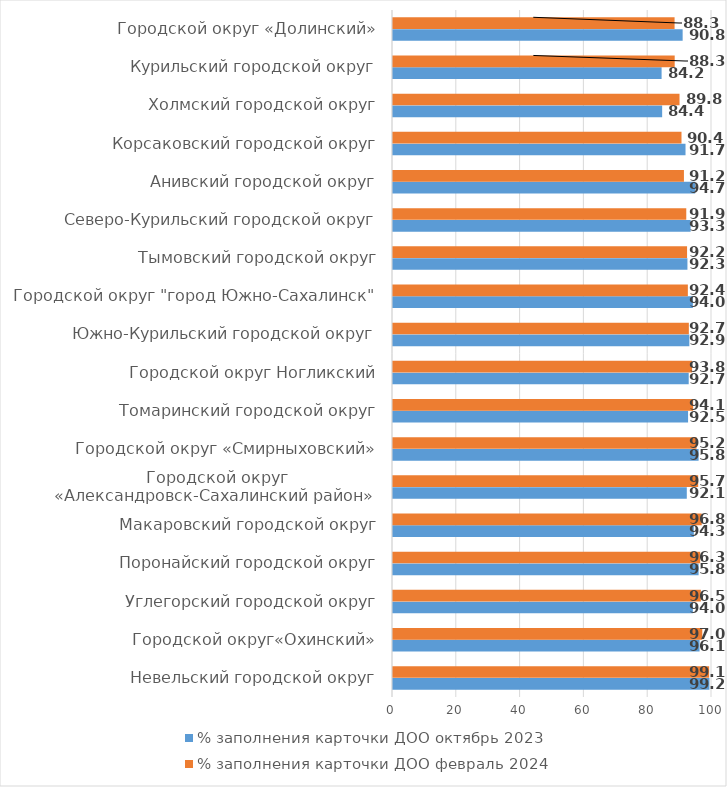
| Category | % заполнения карточки ДОО октябрь 2023 | % заполнения карточки ДОО февраль 2024 |
|---|---|---|
| Невельский городской округ | 99.2 | 99.104 |
| Городской округ«Охинский» | 96.1 | 96.953 |
| Углегорский городской округ | 94 | 96.505 |
| Поронайский городской округ | 95.8 | 96.29 |
| Макаровский городской округ | 94.3 | 96.774 |
| Городской округ «Александровск-Сахалинский район»  | 92.1 | 95.667 |
| Городской округ «Смирныховский» | 95.8 | 95.161 |
| Томаринский городской округ | 92.5 | 94.086 |
| Городской округ Ногликский | 92.7 | 93.75 |
| Южно-Курильский городской округ | 92.9 | 92.742 |
| Городской округ "город Южно-Сахалинск" | 94 | 92.432 |
| Тымовский городской округ | 92.3 | 92.184 |
| Северо-Курильский городской округ | 93.3 | 91.935 |
| Анивский городской округ | 94.722 | 91.202 |
| Корсаковский городской округ | 91.7 | 90.438 |
| Холмский городской округ | 84.375 | 89.819 |
| Курильский городской округ | 84.2 | 88.306 |
| Городской округ «Долинский» | 90.8 | 88.27 |